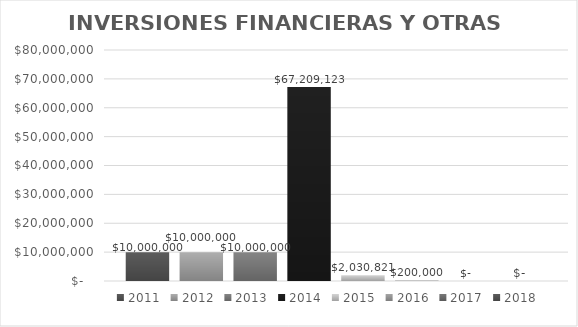
| Category | 2011 | 2012 | 2013 | 2014 | 2015 | 2016 | 2017 | 2018 |
|---|---|---|---|---|---|---|---|---|
| 0 | 10000000 | 10000000 | 10000000 | 67209123 | 2030821 | 200000 | 0 | 0 |